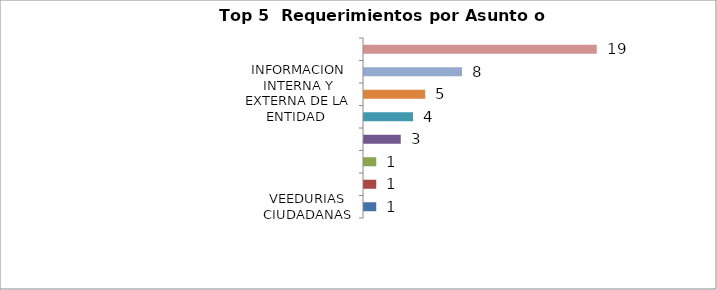
| Category | Total |
|---|---|
| VEEDURIAS CIUDADANAS | 1 |
| PORTAFOLIO DE SERVICIOS - BANCO DE PROGRAMAS Y PROYECTOS E INFORMACIÓN DE PROYECTOS | 1 |
| CALIDAD DE LA EDUCACIÓN - QUEJAS ADMINISTRATIVOS - INCIDENCIA DISCIPLINARIA | 1 |
| GESTIÓN ADMINISTRATIVA Y FINANCIERA - NOMINA | 3 |
| ATENCIÓN Y SERVICIO A LA CIUDADANÍA - DEFICIENCIA EN LA PRESTACIÓN DEL SERVICIO | 4 |
| INFORMACION INTERNA Y EXTERNA DE LA ENTIDAD  | 5 |
| TRASLADO POR NO COMPETENCIA | 8 |
| TEMAS DE CONTRATACIÓN | 19 |